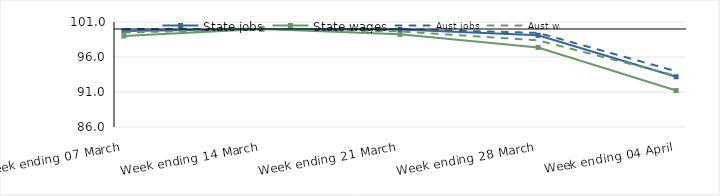
| Category | State jobs | State wages | Aust jobs | Aust wages |
|---|---|---|---|---|
| 2020-03-07 | 99.724 | 98.998 | 100.003 | 99.487 |
| 2020-03-14 | 100 | 100 | 100 | 100 |
| 2020-03-21 | 99.919 | 99.233 | 99.966 | 99.652 |
| 2020-03-28 | 99.102 | 97.367 | 99.451 | 98.382 |
| 2020-04-04 | 93.176 | 91.207 | 93.968 | 93.326 |